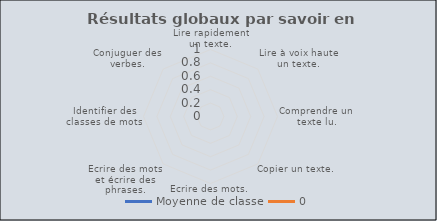
| Category | Moyenne de classe | 0 |
|---|---|---|
| Lire rapidement un texte. | 0 |  |
| Lire à voix haute un texte. | 0 |  |
| Comprendre un texte lu. | 0 |  |
| Copier un texte. | 0 |  |
| Ecrire des mots. | 0 |  |
| Ecrire des mots et écrire des phrases. | 0 |  |
| Identifier des classes de mots | 0 |  |
| Conjuguer des verbes. | 0 |  |